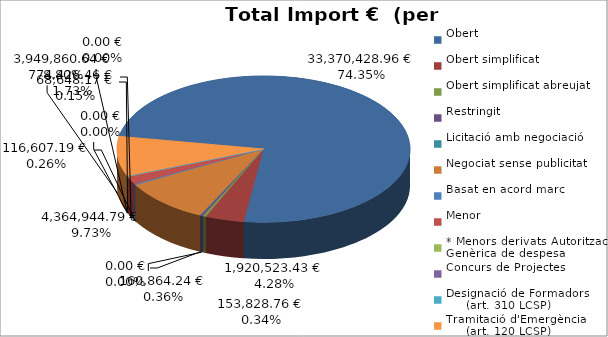
| Category | Total preu
(amb IVA) |
|---|---|
| Obert | 33370428.96 |
| Obert simplificat | 1920523.43 |
| Obert simplificat abreujat | 153828.76 |
| Restringit | 160864.24 |
| Licitació amb negociació | 0 |
| Negociat sense publicitat | 4364944.79 |
| Basat en acord marc | 116607.19 |
| Menor | 774426.46 |
| * Menors derivats Autorització Genèrica de despesa | 68648.17 |
| Concurs de Projectes | 0 |
| Designació de Formadors
     (art. 310 LCSP) | 0 |
| Tramitació d'Emergència
     (art. 120 LCSP) | 3949860.64 |